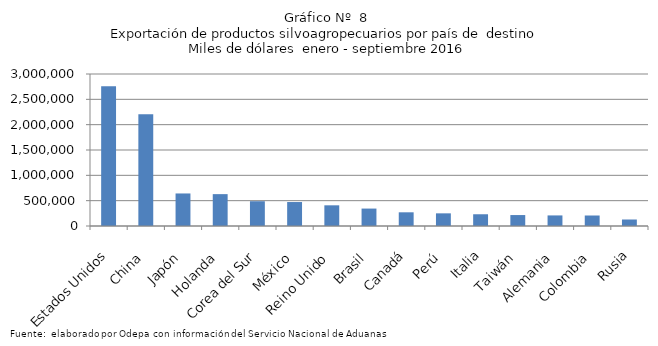
| Category | Series 0 |
|---|---|
| Estados Unidos | 2757232.375 |
| China | 2204375.136 |
| Japón | 642205.298 |
| Holanda | 628921.894 |
| Corea del Sur | 488788.13 |
| México | 473065.441 |
| Reino Unido | 408250.407 |
| Brasil | 344027.4 |
| Canadá | 270305.739 |
| Perú | 249813.29 |
| Italia | 231747.385 |
| Taiwán | 216044.816 |
| Alemania | 208756.211 |
| Colombia | 207204.846 |
| Rusia | 128235.43 |